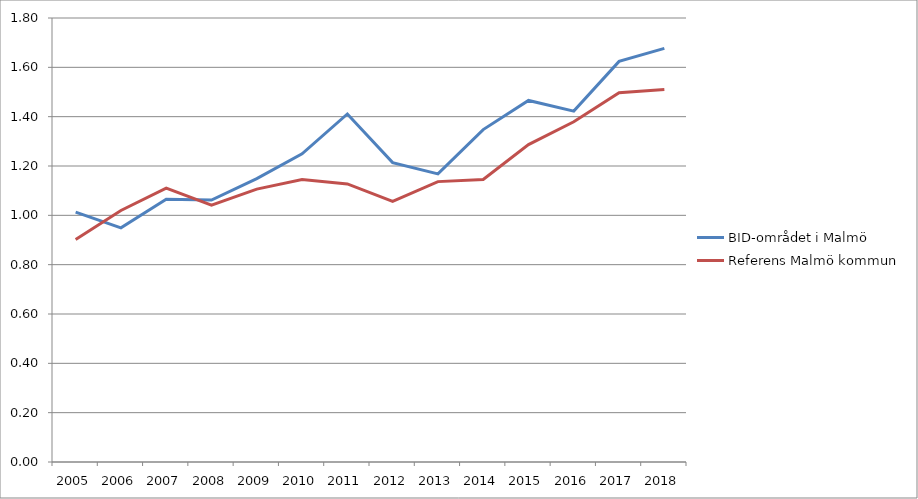
| Category | BID-området i Malmö | Referens Malmö kommun |
|---|---|---|
| 2005.0 | 1.013 | 0.902 |
| 2006.0 | 0.949 | 1.02 |
| 2007.0 | 1.066 | 1.11 |
| 2008.0 | 1.062 | 1.041 |
| 2009.0 | 1.149 | 1.106 |
| 2010.0 | 1.25 | 1.145 |
| 2011.0 | 1.411 | 1.127 |
| 2012.0 | 1.214 | 1.056 |
| 2013.0 | 1.168 | 1.137 |
| 2014.0 | 1.348 | 1.145 |
| 2015.0 | 1.466 | 1.287 |
| 2016.0 | 1.423 | 1.379 |
| 2017.0 | 1.624 | 1.497 |
| 2018.0 | 1.677 | 1.51 |